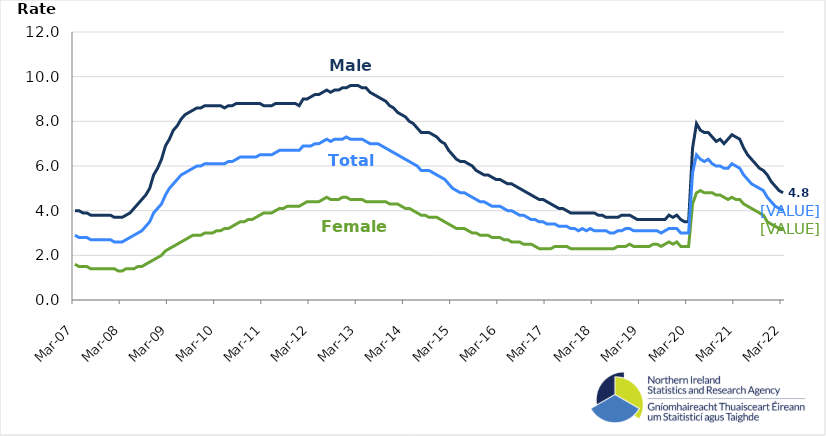
| Category | Male | Female | Total |
|---|---|---|---|
| 2007-03-01 | 4 | 1.6 | 2.9 |
| 2007-04-01 | 4 | 1.5 | 2.8 |
| 2007-05-01 | 3.9 | 1.5 | 2.8 |
| 2007-06-01 | 3.9 | 1.5 | 2.8 |
| 2007-07-01 | 3.8 | 1.4 | 2.7 |
| 2007-08-01 | 3.8 | 1.4 | 2.7 |
| 2007-09-01 | 3.8 | 1.4 | 2.7 |
| 2007-10-01 | 3.8 | 1.4 | 2.7 |
| 2007-11-01 | 3.8 | 1.4 | 2.7 |
| 2007-12-01 | 3.8 | 1.4 | 2.7 |
| 2008-01-01 | 3.7 | 1.4 | 2.6 |
| 2008-02-01 | 3.7 | 1.3 | 2.6 |
| 2008-03-01 | 3.7 | 1.3 | 2.6 |
| 2008-04-01 | 3.8 | 1.4 | 2.7 |
| 2008-05-01 | 3.9 | 1.4 | 2.8 |
| 2008-06-01 | 4.1 | 1.4 | 2.9 |
| 2008-07-01 | 4.3 | 1.5 | 3 |
| 2008-08-01 | 4.5 | 1.5 | 3.1 |
| 2008-09-01 | 4.7 | 1.6 | 3.3 |
| 2008-10-01 | 5 | 1.7 | 3.5 |
| 2008-11-01 | 5.6 | 1.8 | 3.9 |
| 2008-12-01 | 5.9 | 1.9 | 4.1 |
| 2009-01-01 | 6.3 | 2 | 4.3 |
| 2009-02-01 | 6.9 | 2.2 | 4.7 |
| 2009-03-01 | 7.2 | 2.3 | 5 |
| 2009-04-01 | 7.6 | 2.4 | 5.2 |
| 2009-05-01 | 7.8 | 2.5 | 5.4 |
| 2009-06-01 | 8.1 | 2.6 | 5.6 |
| 2009-07-01 | 8.3 | 2.7 | 5.7 |
| 2009-08-01 | 8.4 | 2.8 | 5.8 |
| 2009-09-01 | 8.5 | 2.9 | 5.9 |
| 2009-10-01 | 8.6 | 2.9 | 6 |
| 2009-11-01 | 8.6 | 2.9 | 6 |
| 2009-12-01 | 8.7 | 3 | 6.1 |
| 2010-01-01 | 8.7 | 3 | 6.1 |
| 2010-02-01 | 8.7 | 3 | 6.1 |
| 2010-03-01 | 8.7 | 3.1 | 6.1 |
| 2010-04-01 | 8.7 | 3.1 | 6.1 |
| 2010-05-01 | 8.6 | 3.2 | 6.1 |
| 2010-06-01 | 8.7 | 3.2 | 6.2 |
| 2010-07-01 | 8.7 | 3.3 | 6.2 |
| 2010-08-01 | 8.8 | 3.4 | 6.3 |
| 2010-09-01 | 8.8 | 3.5 | 6.4 |
| 2010-10-01 | 8.8 | 3.5 | 6.4 |
| 2010-11-01 | 8.8 | 3.6 | 6.4 |
| 2010-12-01 | 8.8 | 3.6 | 6.4 |
| 2011-01-01 | 8.8 | 3.7 | 6.4 |
| 2011-02-01 | 8.8 | 3.8 | 6.5 |
| 2011-03-01 | 8.7 | 3.9 | 6.5 |
| 2011-04-01 | 8.7 | 3.9 | 6.5 |
| 2011-05-01 | 8.7 | 3.9 | 6.5 |
| 2011-06-01 | 8.8 | 4 | 6.6 |
| 2011-07-01 | 8.8 | 4.1 | 6.7 |
| 2011-08-01 | 8.8 | 4.1 | 6.7 |
| 2011-09-01 | 8.8 | 4.2 | 6.7 |
| 2011-10-01 | 8.8 | 4.2 | 6.7 |
| 2011-11-01 | 8.8 | 4.2 | 6.7 |
| 2011-12-01 | 8.7 | 4.2 | 6.7 |
| 2012-01-01 | 9 | 4.3 | 6.9 |
| 2012-02-01 | 9 | 4.4 | 6.9 |
| 2012-03-01 | 9.1 | 4.4 | 6.9 |
| 2012-04-01 | 9.2 | 4.4 | 7 |
| 2012-05-01 | 9.2 | 4.4 | 7 |
| 2012-06-01 | 9.3 | 4.5 | 7.1 |
| 2012-07-01 | 9.4 | 4.6 | 7.2 |
| 2012-08-01 | 9.3 | 4.5 | 7.1 |
| 2012-09-01 | 9.4 | 4.5 | 7.2 |
| 2012-10-01 | 9.4 | 4.5 | 7.2 |
| 2012-11-01 | 9.5 | 4.6 | 7.2 |
| 2012-12-01 | 9.5 | 4.6 | 7.3 |
| 2013-01-01 | 9.6 | 4.5 | 7.2 |
| 2013-02-01 | 9.6 | 4.5 | 7.2 |
| 2013-03-01 | 9.6 | 4.5 | 7.2 |
| 2013-04-01 | 9.5 | 4.5 | 7.2 |
| 2013-05-01 | 9.5 | 4.4 | 7.1 |
| 2013-06-01 | 9.3 | 4.4 | 7 |
| 2013-07-01 | 9.2 | 4.4 | 7 |
| 2013-08-01 | 9.1 | 4.4 | 7 |
| 2013-09-01 | 9 | 4.4 | 6.9 |
| 2013-10-01 | 8.9 | 4.4 | 6.8 |
| 2013-11-01 | 8.7 | 4.3 | 6.7 |
| 2013-12-01 | 8.6 | 4.3 | 6.6 |
| 2014-01-01 | 8.4 | 4.3 | 6.5 |
| 2014-02-01 | 8.3 | 4.2 | 6.4 |
| 2014-03-01 | 8.2 | 4.1 | 6.3 |
| 2014-04-01 | 8 | 4.1 | 6.2 |
| 2014-05-01 | 7.9 | 4 | 6.1 |
| 2014-06-01 | 7.7 | 3.9 | 6 |
| 2014-07-01 | 7.5 | 3.8 | 5.8 |
| 2014-08-01 | 7.5 | 3.8 | 5.8 |
| 2014-09-01 | 7.5 | 3.7 | 5.8 |
| 2014-10-01 | 7.4 | 3.7 | 5.7 |
| 2014-11-01 | 7.3 | 3.7 | 5.6 |
| 2014-12-01 | 7.1 | 3.6 | 5.5 |
| 2015-01-01 | 7 | 3.5 | 5.4 |
| 2015-02-01 | 6.7 | 3.4 | 5.2 |
| 2015-03-01 | 6.5 | 3.3 | 5 |
| 2015-04-01 | 6.3 | 3.2 | 4.9 |
| 2015-05-01 | 6.2 | 3.2 | 4.8 |
| 2015-06-01 | 6.2 | 3.2 | 4.8 |
| 2015-07-01 | 6.1 | 3.1 | 4.7 |
| 2015-08-01 | 6 | 3 | 4.6 |
| 2015-09-01 | 5.8 | 3 | 4.5 |
| 2015-10-01 | 5.7 | 2.9 | 4.4 |
| 2015-11-01 | 5.6 | 2.9 | 4.4 |
| 2015-12-01 | 5.6 | 2.9 | 4.3 |
| 2016-01-01 | 5.5 | 2.8 | 4.2 |
| 2016-02-01 | 5.4 | 2.8 | 4.2 |
| 2016-03-01 | 5.4 | 2.8 | 4.2 |
| 2016-04-01 | 5.3 | 2.7 | 4.1 |
| 2016-05-01 | 5.2 | 2.7 | 4 |
| 2016-06-01 | 5.2 | 2.6 | 4 |
| 2016-07-01 | 5.1 | 2.6 | 3.9 |
| 2016-08-01 | 5 | 2.6 | 3.8 |
| 2016-09-01 | 4.9 | 2.5 | 3.8 |
| 2016-10-01 | 4.8 | 2.5 | 3.7 |
| 2016-11-01 | 4.7 | 2.5 | 3.6 |
| 2016-12-01 | 4.6 | 2.4 | 3.6 |
| 2017-01-01 | 4.5 | 2.3 | 3.5 |
| 2017-02-01 | 4.5 | 2.3 | 3.5 |
| 2017-03-01 | 4.4 | 2.3 | 3.4 |
| 2017-04-01 | 4.3 | 2.3 | 3.4 |
| 2017-05-01 | 4.2 | 2.4 | 3.4 |
| 2017-06-01 | 4.1 | 2.4 | 3.3 |
| 2017-07-01 | 4.1 | 2.4 | 3.3 |
| 2017-08-01 | 4 | 2.4 | 3.3 |
| 2017-09-01 | 3.9 | 2.3 | 3.2 |
| 2017-10-01 | 3.9 | 2.3 | 3.2 |
| 2017-11-01 | 3.9 | 2.3 | 3.1 |
| 2017-12-01 | 3.9 | 2.3 | 3.2 |
| 2018-01-01 | 3.9 | 2.3 | 3.1 |
| 2018-02-01 | 3.9 | 2.3 | 3.2 |
| 2018-03-01 | 3.9 | 2.3 | 3.1 |
| 2018-04-01 | 3.8 | 2.3 | 3.1 |
| 2018-05-01 | 3.8 | 2.3 | 3.1 |
| 2018-06-01 | 3.7 | 2.3 | 3.1 |
| 2018-07-01 | 3.7 | 2.3 | 3 |
| 2018-08-01 | 3.7 | 2.3 | 3 |
| 2018-09-01 | 3.7 | 2.4 | 3.1 |
| 2018-10-01 | 3.8 | 2.4 | 3.1 |
| 2018-11-01 | 3.8 | 2.4 | 3.2 |
| 2018-12-01 | 3.8 | 2.5 | 3.2 |
| 2019-01-01 | 3.7 | 2.4 | 3.1 |
| 2019-02-01 | 3.6 | 2.4 | 3.1 |
| 2019-03-01 | 3.6 | 2.4 | 3.1 |
| 2019-04-01 | 3.6 | 2.4 | 3.1 |
| 2019-05-01 | 3.6 | 2.4 | 3.1 |
| 2019-06-01 | 3.6 | 2.5 | 3.1 |
| 2019-07-01 | 3.6 | 2.5 | 3.1 |
| 2019-08-01 | 3.6 | 2.4 | 3 |
| 2019-09-01 | 3.6 | 2.5 | 3.1 |
| 2019-10-01 | 3.8 | 2.6 | 3.2 |
| 2019-11-01 | 3.7 | 2.5 | 3.2 |
| 2019-12-01 | 3.8 | 2.6 | 3.2 |
| 2020-01-01 | 3.6 | 2.4 | 3 |
| 2020-02-01 | 3.5 | 2.4 | 3 |
| 2020-03-01 | 3.5 | 2.4 | 3 |
| 2020-04-01 | 6.8 | 4.3 | 5.7 |
| 2020-05-01 | 7.9 | 4.8 | 6.5 |
| 2020-06-01 | 7.6 | 4.9 | 6.3 |
| 2020-07-01 | 7.5 | 4.8 | 6.2 |
| 2020-08-01 | 7.5 | 4.8 | 6.3 |
| 2020-09-01 | 7.3 | 4.8 | 6.1 |
| 2020-10-01 | 7.1 | 4.7 | 6 |
| 2020-11-01 | 7.2 | 4.7 | 6 |
| 2020-12-01 | 7 | 4.6 | 5.9 |
| 2021-01-01 | 7.2 | 4.5 | 5.9 |
| 2021-02-01 | 7.4 | 4.6 | 6.1 |
| 2021-03-01 | 7.3 | 4.5 | 6 |
| 2021-04-01 | 7.2 | 4.5 | 5.9 |
| 2021-05-01 | 6.8 | 4.3 | 5.6 |
| 2021-06-01 | 6.5 | 4.2 | 5.4 |
| 2021-07-01 | 6.3 | 4.1 | 5.2 |
| 2021-08-01 | 6.1 | 4 | 5.1 |
| 2021-09-01 | 5.9 | 3.9 | 5 |
| 2021-10-01 | 5.8 | 3.8 | 4.9 |
| 2021-11-01 | 5.6 | 3.5 | 4.6 |
| 2021-12-01 | 5.3 | 3.4 | 4.4 |
| 2022-01-01 | 5.1 | 3.3 | 4.2 |
| 2022-02-01 | 4.9 | 3.2 | 4.1 |
| 2022-03-01 | 4.8 | 3.2 | 4 |